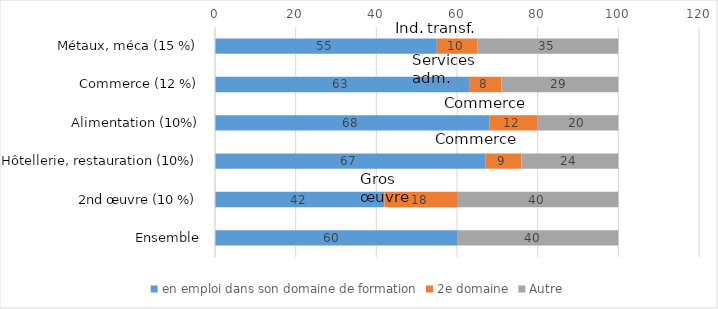
| Category | en emploi dans son domaine de formation | 2e domaine | Autre |
|---|---|---|---|
| Métaux, méca (15 %) | 55 | 10 | 35 |
| Commerce (12 %) | 63 | 8 | 29 |
| Alimentation (10%) | 68 | 12 | 20 |
| Hôtellerie, restauration (10%) | 67 | 9 | 24 |
| 2nd œuvre (10 %) | 42 | 18 | 40 |
| Ensemble | 60 | 0 | 40 |